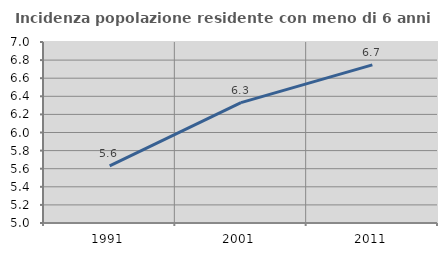
| Category | Incidenza popolazione residente con meno di 6 anni |
|---|---|
| 1991.0 | 5.631 |
| 2001.0 | 6.331 |
| 2011.0 | 6.748 |